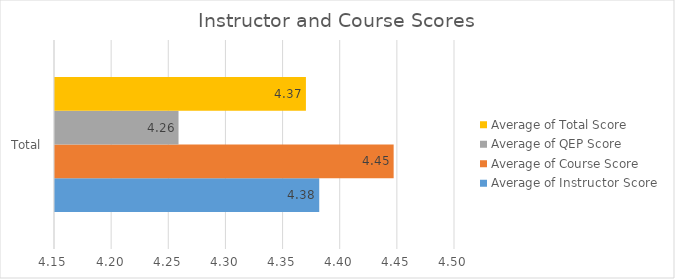
| Category | Average of Instructor Score | Average of Course Score | Average of QEP Score | Average of Total Score |
|---|---|---|---|---|
| Total | 4.381 | 4.446 | 4.258 | 4.37 |